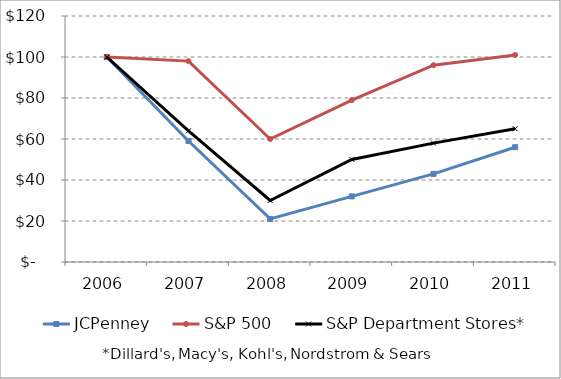
| Category | JCPenney | S&P 500 | S&P Department Stores* |
|---|---|---|---|
| 2006.0 | 100 | 100 | 100 |
| 2007.0 | 59 | 98 | 64 |
| 2008.0 | 21 | 60 | 30 |
| 2009.0 | 32 | 79 | 50 |
| 2010.0 | 43 | 96 | 58 |
| 2011.0 | 56 | 101 | 65 |